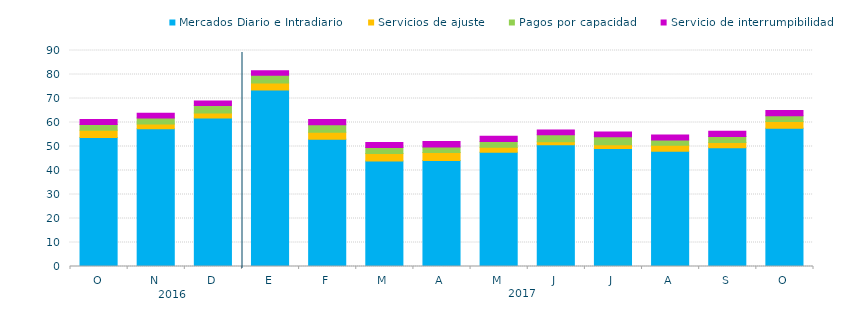
| Category | Mercados Diario e Intradiario  | Servicios de ajuste | Pagos por capacidad | Servicio de interrumpibilidad |
|---|---|---|---|---|
| O | 53.78 | 3 | 2.4 | 2.03 |
| N | 57.41 | 1.94 | 2.57 | 1.95 |
| D | 61.87 | 2.04 | 3.17 | 1.88 |
| E | 73.59 | 2.89 | 3.25 | 1.88 |
| F | 53.05 | 2.84 | 3.17 | 2.17 |
| M | 43.94 | 3.12 | 2.51 | 2.06 |
| A | 44.2 | 3.27 | 2.36 | 2.28 |
| M | 47.6 | 2.12 | 2.35 | 2.15 |
| J | 50.77 | 1.24 | 2.9 | 2 |
| J | 49.13 | 1.65 | 3.28 | 1.94 |
| A | 48.03 | 2.49 | 2.23 | 1.99 |
| S | 49.52 | 2.19 | 2.5 | 2.15 |
| O | 57.6 | 2.79 | 2.41 | 2.16 |